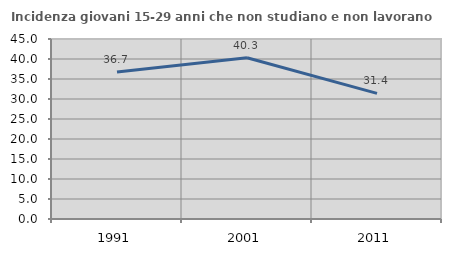
| Category | Incidenza giovani 15-29 anni che non studiano e non lavorano  |
|---|---|
| 1991.0 | 36.741 |
| 2001.0 | 40.298 |
| 2011.0 | 31.399 |